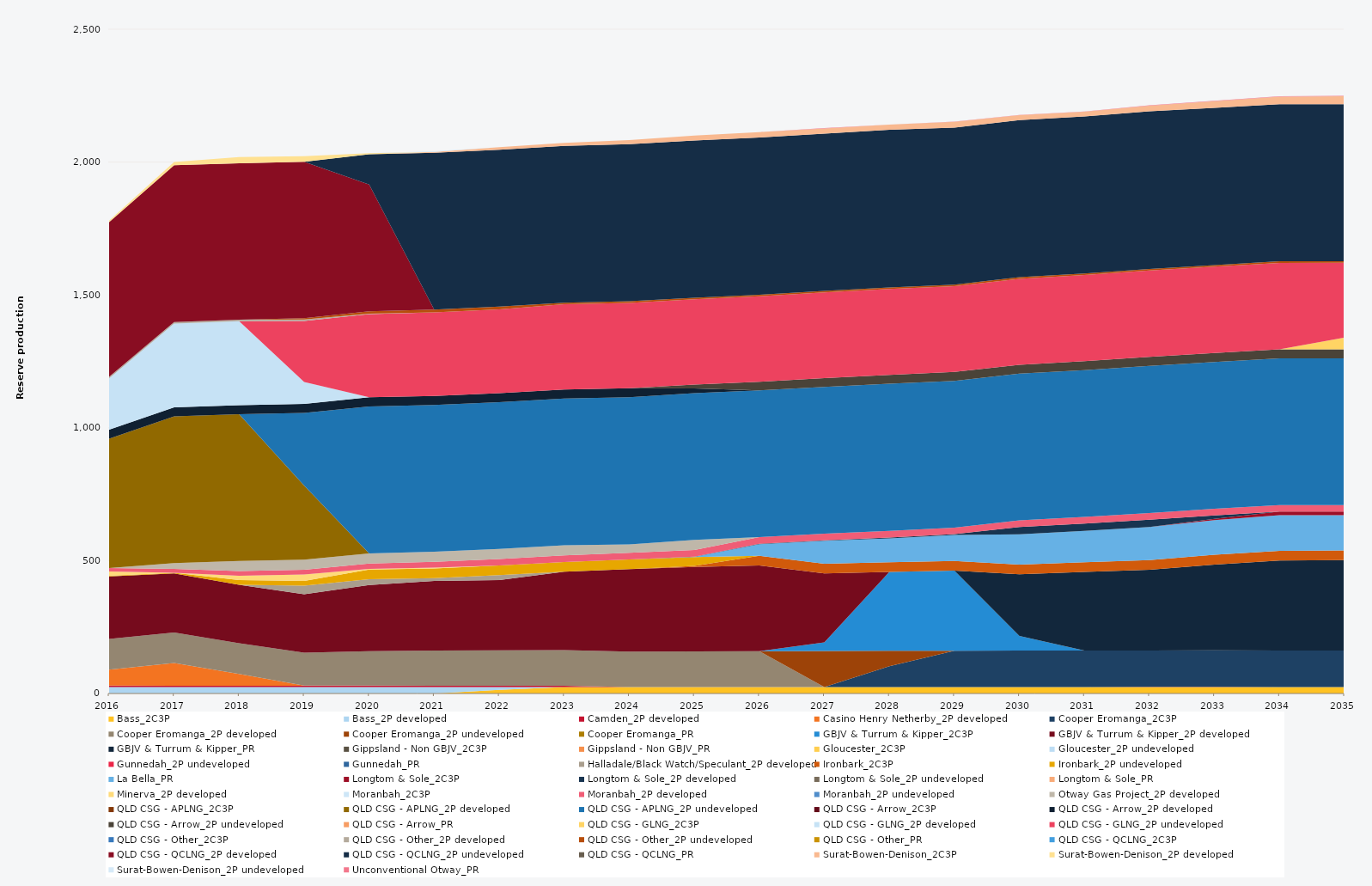
| Category | Bass_2C3P | Bass_2P developed | Camden_2P developed | Casino Henry Netherby_2P developed | Cooper Eromanga_2C3P | Cooper Eromanga_2P developed | Cooper Eromanga_2P undeveloped | Cooper Eromanga_PR | GBJV & Turrum & Kipper_2C3P | GBJV & Turrum & Kipper_2P developed | GBJV & Turrum & Kipper_PR | Gippsland - Non GBJV_2C3P | Gippsland - Non GBJV_PR | Gloucester_2C3P | Gloucester_2P undeveloped | Gunnedah_2P undeveloped | Gunnedah_PR | Halladale/Black Watch/Speculant_2P developed | Ironbark_2C3P | Ironbark_2P undeveloped | La Bella_PR | Longtom & Sole_2C3P | Longtom & Sole_2P developed | Longtom & Sole_2P undeveloped | Longtom & Sole_PR | Minerva_2P developed | Moranbah_2C3P | Moranbah_2P developed | Moranbah_2P undeveloped | Otway Gas Project_2P developed | QLD CSG - APLNG_2C3P | QLD CSG - APLNG_2P developed | QLD CSG - APLNG_2P undeveloped | QLD CSG - Arrow_2C3P | QLD CSG - Arrow_2P developed | QLD CSG - Arrow_2P undeveloped | QLD CSG - Arrow_PR | QLD CSG - GLNG_2C3P | QLD CSG - GLNG_2P developed | QLD CSG - GLNG_2P undeveloped | QLD CSG - Other_2C3P | QLD CSG - Other_2P developed | QLD CSG - Other_2P undeveloped | QLD CSG - Other_PR | QLD CSG - QCLNG_2C3P | QLD CSG - QCLNG_2P developed | QLD CSG - QCLNG_2P undeveloped | QLD CSG - QCLNG_PR | Surat-Bowen-Denison_2C3P | Surat-Bowen-Denison_2P developed | Surat-Bowen-Denison_2P undeveloped | Unconventional Otway_PR |
|---|---|---|---|---|---|---|---|---|---|---|---|---|---|---|---|---|---|---|---|---|---|---|---|---|---|---|---|---|---|---|---|---|---|---|---|---|---|---|---|---|---|---|---|---|---|---|---|---|---|---|---|---|
| 2016 | 0 | 24.522 | 5 | 60.226 | 0 | 115.768 | 0 | 0 | 0 | 235.041 | 0 | 0 | 0 | 0 | 0 | 0 | 0 | 0 | 0 | 2.587 | 0 | 0 | 0 | 0 | 0 | 16 | 0 | 13.144 | 0 | 0 | 0 | 486.482 | 0 | 0 | 34.038 | 0 | 0 | 0 | 192.994 | 0 | 0 | 5.856 | 0 | 0 | 0 | 582.664 | 0 | 0 | 0 | 5.579 | 0 | 0 |
| 2017 | 0 | 24.455 | 5 | 84.98 | 0 | 115.078 | 0 | 0 | 0 | 222.562 | 0 | 0 | 0 | 0 | 0 | 0 | 0 | 0 | 0 | 1.968 | 0 | 0 | 0 | 0 | 0 | 0 | 0 | 14.794 | 0 | 22.115 | 0 | 552.245 | 0 | 0 | 33.945 | 0 | 0 | 0 | 315.23 | 0 | 0 | 5.84 | 0 | 0 | 0 | 589.592 | 0 | 0 | 0 | 12.824 | 0 | 0 |
| 2018 | 0 | 24.455 | 5 | 44.364 | 0 | 115.255 | 0 | 0 | 0 | 220 | 0 | 0 | 0 | 0 | 0 | 0 | 0 | 0 | 0 | 18.089 | 0 | 0 | 0 | 0 | 0 | 15.555 | 0 | 17.995 | 0 | 38 | 0 | 552.245 | 0 | 0 | 33.945 | 0 | 0 | 0 | 316.32 | 0 | 0 | 5.84 | 0 | 0 | 0 | 588.744 | 0 | 0 | 0 | 23.202 | 0 | 0 |
| 2019 | 0 | 24.455 | 5 | 0.69 | 0 | 123.776 | 0 | 0 | 0 | 220 | 0 | 0 | 0 | 0 | 0 | 0 | 0 | 31.826 | 0 | 18.25 | 0 | 0 | 0 | 0 | 0 | 23.725 | 0 | 18.062 | 0 | 38 | 0 | 278.578 | 273.667 | 0 | 33.945 | 0 | 0 | 0 | 82.756 | 229.273 | 0 | 5.84 | 4.563 | 0 | 0 | 588.948 | 0 | 0 | 0 | 21.122 | 0 | 0 |
| 2020 | 0 | 24.522 | 5 | 0 | 0 | 130.053 | 0 | 0 | 0 | 248.802 | 0 | 0 | 0 | 0 | 0 | 0 | 0 | 21.545 | 0 | 36.6 | 0 | 0 | 0 | 0 | 0 | 2.629 | 0 | 19.632 | 0 | 38 | 0 | 0 | 553.758 | 0 | 34.038 | 0 | 0 | 0 | 0 | 313.197 | 0 | 1.624 | 8.795 | 0 | 0 | 477.452 | 113.625 | 0 | 0 | 4.088 | 0 | 0 |
| 2021 | 0 | 24.455 | 5 | 0 | 0 | 132.173 | 0 | 0 | 0 | 261.97 | 0 | 0 | 0 | 0 | 0 | 0 | 0 | 10.636 | 0 | 36.5 | 0 | 0 | 0 | 0 | 0 | 2.842 | 0 | 22.187 | 0 | 38 | 0 | 0 | 552.245 | 0 | 33.945 | 0 | 0 | 0 | 0 | 314.213 | 0 | 0 | 10.403 | 0 | 0 | 0 | 590.252 | 0 | 3.698 | 0 | 2 | 0 |
| 2022 | 13.672 | 10.783 | 5 | 0 | 0 | 133.36 | 0 | 0 | 0 | 264.464 | 0 | 0 | 0 | 0 | 0 | 0 | 0 | 17.993 | 0 | 36.5 | 0 | 0 | 0 | 0 | 0 | 0 | 0 | 24.144 | 0 | 38 | 0 | 0 | 552.245 | 0 | 33.945 | 0 | 0 | 0 | 0 | 315.789 | 0 | 0 | 10.403 | 0 | 0 | 0 | 590.262 | 0 | 9.665 | 0 | 0 | 0 |
| 2023 | 24.455 | 0 | 5 | 0 | 0 | 133.541 | 0 | 0 | 0 | 295.675 | 0 | 0 | 0 | 0 | 0 | 0 | 0 | 0 | 0 | 36.5 | 0 | 0 | 0 | 0 | 0 | 0 | 0 | 24.788 | 0 | 38 | 0 | 0 | 552.245 | 0 | 33.945 | 0 | 0 | 0 | 0 | 320.75 | 0 | 0 | 5.84 | 0 | 0 | 0 | 589.919 | 0 | 11.944 | 0 | 0 | 0 |
| 2024 | 24.522 | 0 | 0 | 0 | 0 | 133.356 | 0 | 0 | 0 | 310.296 | 0 | 0 | 0 | 0 | 0 | 0 | 0 | 0 | 0 | 36.6 | 0 | 0 | 0 | 0 | 0 | 0 | 0 | 24.888 | 0 | 31.491 | 0 | 0 | 553.758 | 0 | 34.038 | 0 | 0 | 0 | 0 | 321.243 | 0 | 0 | 5.856 | 0 | 0 | 0 | 591.563 | 0 | 15.015 | 0 | 0 | 0 |
| 2025 | 24.455 | 0 | 0 | 0 | 0 | 134.054 | 0 | 0 | 0 | 318.062 | 0 | 0 | 0 | 0 | 0 | 0 | 0 | 0 | 4.094 | 32.406 | 1.302 | 0 | 0.678 | 0 | 0 | 0 | 0 | 24.82 | 0 | 38 | 0 | 0 | 552.245 | 0 | 18.166 | 14.198 | 0 | 0 | 0 | 320.866 | 0 | 0 | 5.84 | 0 | 0 | 0 | 591.798 | 0 | 18.875 | 0 | 0 | 0 |
| 2026 | 24.455 | 0 | 0 | 0 | 0 | 134.586 | 0 | 0 | 0 | 322.91 | 0 | 0 | 0 | 0 | 0 | 0 | 0 | 0 | 36.5 | 0 | 43.233 | 0 | 1.898 | 0 | 0 | 0 | 0 | 24.82 | 0 | 0 | 0 | 0 | 552.245 | 0 | 0 | 32.779 | 0 | 0 | 0 | 321.744 | 0 | 0 | 5.84 | 0 | 0 | 0 | 591.755 | 0 | 19.952 | 0 | 0 | 0.308 |
| 2027 | 24.455 | 0 | 0 | 0 | 0 | 0 | 135.887 | 0 | 32.472 | 259.323 | 0 | 0 | 0 | 0 | 0 | 0 | 0 | 0 | 36.5 | 0 | 85.895 | 0 | 2.255 | 0 | 0 | 0 | 0 | 24.82 | 0 | 0 | 0 | 0 | 552.245 | 0 | 0 | 33.074 | 0 | 0 | 0 | 322.385 | 0 | 0 | 5.84 | 0 | 0 | 0 | 591.711 | 0 | 19.981 | 0 | 0 | 1.565 |
| 2028 | 24.522 | 0 | 0 | 0 | 77.924 | 0 | 58.695 | 0 | 296.342 | 0 | 0 | 0 | 0 | 0 | 0 | 0 | 0 | 0 | 36.6 | 0 | 89.899 | 0 | 2.916 | 0 | 0 | 0 | 0 | 24.888 | 0 | 0 | 0 | 0 | 553.758 | 0 | 0 | 33.226 | 0 | 0 | 0 | 323.324 | 0 | 0 | 5.856 | 0 | 0 | 0 | 593.257 | 0 | 19.506 | 0 | 0 | 0.615 |
| 2029 | 24.455 | 0 | 0 | 0 | 136.513 | 0 | 0 | 0 | 301.181 | 0 | 0 | 0 | 0 | 0 | 0 | 0 | 0 | 0 | 36.5 | 0 | 97.715 | 0 | 3.197 | 0 | 0 | 0 | 0 | 24.82 | 0 | 0 | 0 | 0 | 552.245 | 0 | 0 | 33.357 | 0 | 0 | 0 | 322.634 | 0 | 0 | 5.84 | 0 | 0 | 0 | 591.623 | 0 | 21.122 | 0 | 0 | 1.309 |
| 2030 | 24.455 | 0 | 0 | 0 | 136.875 | 0 | 0 | 0 | 55.72 | 0 | 231.328 | 0 | 0 | 0 | 0 | 0 | 0 | 0 | 36.5 | 0 | 114.461 | 0 | 27.375 | 0 | 0 | 0 | 0 | 24.82 | 0 | 0 | 0 | 0 | 552.245 | 0 | 0 | 33.558 | 0 | 0 | 0 | 323.492 | 0 | 0 | 5.84 | 0 | 0 | 0 | 591.579 | 0 | 18.421 | 0 | 0 | 0.573 |
| 2031 | 24.455 | 0 | 0 | 0 | 136.875 | 0 | 0 | 0 | 0 | 0 | 296.13 | 0 | 0 | 0 | 0 | 0 | 0 | 0 | 36.5 | 0 | 118.501 | 0 | 27.375 | 0 | 0 | 0 | 0 | 24.82 | 0 | 0 | 0 | 0 | 552.245 | 0 | 0 | 33.706 | 0 | 0 | 0 | 324.058 | 0 | 0 | 5.84 | 0 | 0 | 0 | 591.535 | 0 | 17.516 | 0 | 0 | 0.526 |
| 2032 | 24.522 | 0 | 0.153 | 0 | 137.25 | 0 | 0 | 0 | 0 | 0 | 303.718 | 0 | 0 | 0 | 0 | 0 | 0 | 0 | 36.6 | 0 | 124.316 | 0 | 27.45 | 0 | 0 | 0 | 0 | 24.888 | 0 | 0 | 0 | 0 | 553.758 | 0 | 0 | 33.934 | 0 | 0 | 0 | 325.414 | 0 | 0 | 5.856 | 0 | 0 | 0 | 593.081 | 0 | 21.198 | 0 | 0 | 1.721 |
| 2033 | 24.455 | 0 | 0.847 | 0 | 136.875 | 0 | 0 | 0 | 0 | 0 | 323.349 | 0 | 0 | 0 | 0 | 0 | 0 | 0 | 36.5 | 0 | 130.529 | 4.786 | 13.337 | 0 | 0 | 0 | 0 | 24.82 | 0 | 0 | 0 | 0 | 552.245 | 0 | 0 | 33.888 | 0 | 0 | 0 | 324.958 | 0 | 0 | 5.84 | 0 | 0 | 0 | 591.447 | 0 | 25.215 | 0 | 0 | 1.447 |
| 2034 | 24.455 | 0 | 0 | 0 | 136.875 | 0 | 0 | 0 | 0 | 0 | 339.199 | 0 | 0 | 0 | 0 | 0 | 0 | 0 | 36.5 | 0 | 134.105 | 13.333 | 0 | 0 | 0 | 0 | 0 | 24.82 | 0 | 0 | 0 | 0 | 552.245 | 0 | 0 | 33.908 | 0 | 0 | 0 | 325.256 | 0 | 0 | 5.84 | 0 | 0 | 0 | 591.403 | 0 | 28.186 | 0 | 0 | 1.69 |
| 2035 | 24.455 | 0 | 0 | 0 | 136.875 | 0 | 0 | 0 | 0 | 0 | 340.494 | 0 | 0 | 0 | 0 | 0 | 0 | 0 | 36.5 | 0 | 132.958 | 13.219 | 0 | 0 | 0 | 0 | 0 | 24.82 | 0 | 0 | 0 | 0 | 552.245 | 0 | 0 | 33.924 | 0 | 43.792 | 0 | 281.465 | 0 | 0 | 5.84 | 0 | 0 | 0 | 591.053 | 0 | 30.408 | 0 | 0 | 1.246 |